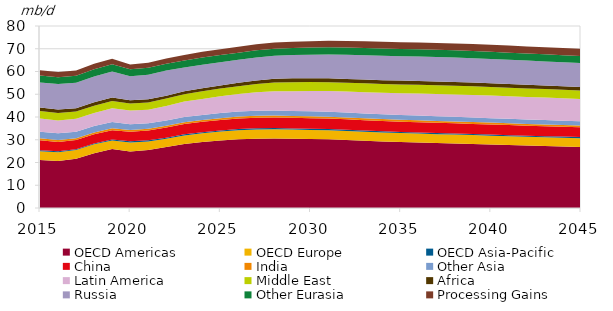
| Category | OECD Americas | OECD Europe | OECD Asia-Pacific | China | India | Other Asia | Latin America | Middle East | Africa | Russia | Other Eurasia | Processing Gains |
|---|---|---|---|---|---|---|---|---|---|---|---|---|
| 2015.0 | 21.079 | 3.848 | 0.454 | 4.393 | 0.876 | 2.886 | 5.781 | 3.291 | 1.572 | 10.965 | 3.109 | 2.246 |
| 2016.0 | 20.665 | 3.888 | 0.419 | 4.09 | 0.86 | 2.903 | 5.663 | 3.268 | 1.494 | 11.229 | 3.028 | 2.265 |
| 2017.0 | 21.615 | 3.875 | 0.387 | 3.969 | 0.867 | 2.819 | 5.721 | 3.139 | 1.481 | 11.171 | 3.135 | 2.304 |
| 2018.0 | 24.1 | 3.876 | 0.408 | 3.985 | 0.869 | 2.775 | 5.79 | 3.193 | 1.488 | 11.355 | 3.204 | 2.343 |
| 2019.0 | 25.882 | 3.74 | 0.523 | 4.054 | 0.833 | 2.746 | 6.086 | 3.157 | 1.506 | 11.507 | 3.196 | 2.373 |
| 2020.0 | 24.867 | 3.921 | 0.523 | 4.161 | 0.782 | 2.534 | 6.025 | 3.155 | 1.411 | 10.541 | 3.032 | 2.155 |
| 2021.0 | 25.447 | 3.793 | 0.512 | 4.319 | 0.779 | 2.422 | 5.96 | 3.185 | 1.341 | 10.8 | 3.039 | 2.287 |
| 2022.0 | 26.865 | 3.575 | 0.48 | 4.479 | 0.774 | 2.303 | 6.338 | 3.287 | 1.294 | 11.033 | 2.936 | 2.399 |
| 2023.0 | 28.147 | 3.755 | 0.464 | 4.564 | 0.776 | 2.323 | 6.737 | 3.287 | 1.295 | 10.381 | 3.074 | 2.469 |
| 2024.0 | 29.004 | 3.85 | 0.451 | 4.559 | 0.789 | 2.269 | 7.043 | 3.325 | 1.347 | 10.38 | 3.128 | 2.519 |
| 2025.0 | 29.671 | 3.917 | 0.48 | 4.607 | 0.803 | 2.255 | 7.427 | 3.34 | 1.392 | 10.225 | 3.105 | 2.573 |
| 2026.0 | 30.258 | 3.935 | 0.532 | 4.641 | 0.815 | 2.241 | 7.698 | 3.408 | 1.514 | 10.098 | 3.083 | 2.61 |
| 2027.0 | 30.481 | 4.007 | 0.543 | 4.643 | 0.825 | 2.234 | 8.141 | 3.631 | 1.588 | 10.098 | 3.108 | 2.66 |
| 2028.0 | 30.59 | 4.049 | 0.53 | 4.634 | 0.836 | 2.238 | 8.412 | 3.829 | 1.641 | 10.126 | 3.144 | 2.707 |
| 2029.0 | 30.417 | 4.058 | 0.515 | 4.627 | 0.839 | 2.228 | 8.679 | 3.943 | 1.694 | 10.213 | 3.157 | 2.752 |
| 2030.0 | 30.293 | 4.027 | 0.515 | 4.626 | 0.848 | 2.216 | 8.878 | 3.942 | 1.698 | 10.332 | 3.163 | 2.791 |
| 2031.0 | 30.175 | 4.003 | 0.502 | 4.626 | 0.849 | 2.189 | 9.039 | 3.916 | 1.702 | 10.475 | 3.17 | 2.827 |
| 2032.0 | 29.876 | 3.98 | 0.498 | 4.607 | 0.846 | 2.162 | 9.189 | 3.885 | 1.702 | 10.622 | 3.175 | 2.861 |
| 2033.0 | 29.561 | 3.96 | 0.496 | 4.58 | 0.847 | 2.136 | 9.328 | 3.873 | 1.702 | 10.697 | 3.181 | 2.892 |
| 2034.0 | 29.254 | 3.942 | 0.489 | 4.555 | 0.839 | 2.109 | 9.459 | 3.86 | 1.7 | 10.714 | 3.187 | 2.922 |
| 2035.0 | 29 | 3.925 | 0.481 | 4.531 | 0.851 | 2.082 | 9.59 | 3.847 | 1.698 | 10.723 | 3.193 | 2.951 |
| 2036.0 | 28.825 | 3.909 | 0.475 | 4.51 | 0.856 | 2.056 | 9.71 | 3.834 | 1.686 | 10.725 | 3.199 | 2.978 |
| 2037.0 | 28.575 | 3.894 | 0.473 | 4.49 | 0.852 | 2.03 | 9.805 | 3.822 | 1.673 | 10.72 | 3.216 | 3.005 |
| 2038.0 | 28.389 | 3.88 | 0.469 | 4.471 | 0.845 | 2.005 | 9.885 | 3.809 | 1.661 | 10.709 | 3.184 | 3.031 |
| 2039.0 | 28.187 | 3.867 | 0.463 | 4.454 | 0.839 | 1.981 | 9.933 | 3.797 | 1.648 | 10.69 | 3.162 | 3.056 |
| 2040.0 | 27.948 | 3.855 | 0.458 | 4.439 | 0.837 | 1.957 | 9.939 | 3.784 | 1.636 | 10.666 | 3.142 | 3.08 |
| 2041.0 | 27.706 | 3.852 | 0.454 | 4.416 | 0.825 | 1.935 | 9.945 | 3.777 | 1.624 | 10.637 | 3.121 | 3.104 |
| 2042.0 | 27.454 | 3.85 | 0.453 | 4.396 | 0.816 | 1.915 | 9.924 | 3.764 | 1.611 | 10.601 | 3.11 | 3.125 |
| 2043.0 | 27.266 | 3.848 | 0.455 | 4.376 | 0.806 | 1.894 | 9.887 | 3.751 | 1.599 | 10.561 | 3.1 | 3.146 |
| 2044.0 | 27.076 | 3.848 | 0.453 | 4.358 | 0.795 | 1.874 | 9.836 | 3.738 | 1.586 | 10.515 | 3.092 | 3.166 |
| 2045.0 | 26.847 | 3.849 | 0.452 | 4.34 | 0.781 | 1.854 | 9.769 | 3.742 | 1.574 | 10.464 | 3.082 | 3.184 |